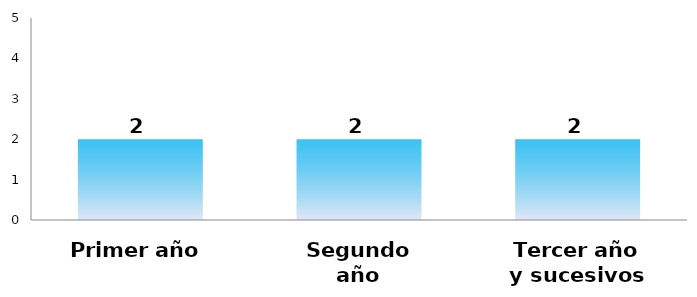
| Category | Series 0 |
|---|---|
| Primer año | 2 |
| Segundo año | 2 |
| Tercer año y sucesivos | 2 |